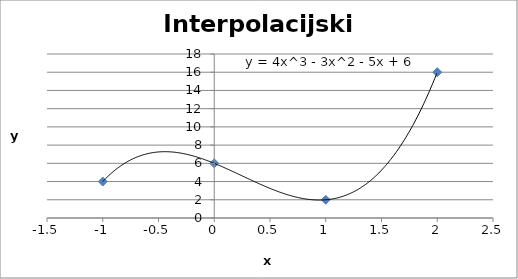
| Category | Series 0 |
|---|---|
| -1.0 | 4 |
| 0.0 | 6 |
| 1.0 | 2 |
| 2.0 | 16 |